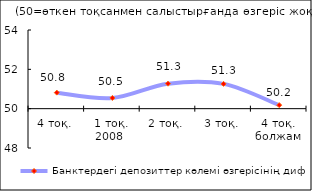
| Category | Банктердегі депозиттер көлемі өзгерісінің диффузиялық индексі |
|---|---|
| 4 тоқ. | 50.815 |
| 1 тоқ. 2008  | 50.545 |
| 2 тоқ. | 51.27 |
| 3 тоқ. | 51.26 |
| 4 тоқ. болжам | 50.18 |